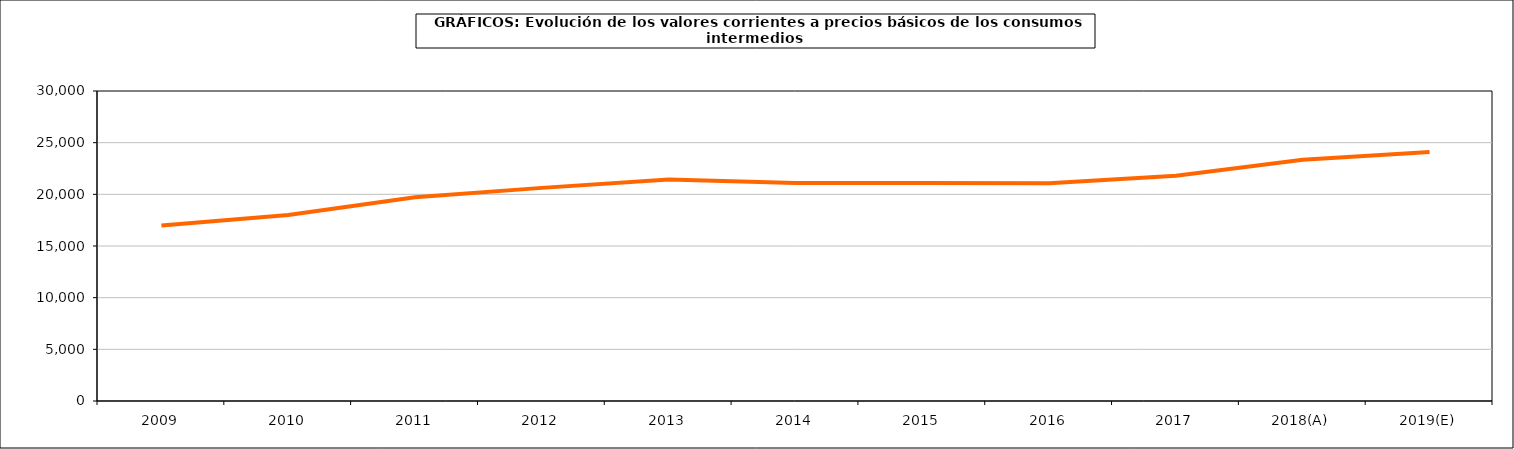
| Category | Total consumos intermedios |
|---|---|
| 2009 | 16992.3 |
| 2010 | 18005.1 |
| 2011 | 19714.8 |
| 2012 | 20625.1 |
| 2013 | 21445.2 |
| 2014 | 21097.4 |
| 2015 | 21104.1 |
| 2016 | 21083.6 |
| 2017 | 21794.5 |
| 2018(A) | 23344.5 |
| 2019(E) | 24100.9 |